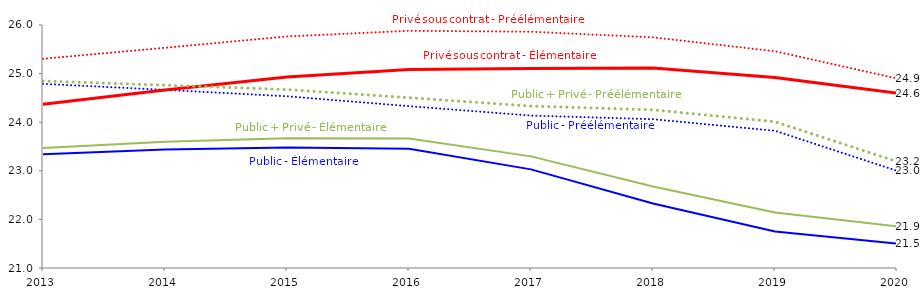
| Category | Public - Préélémentaire | Public - Élémentaire | Privé sous contrat - Préélémentaire | Privé sous contrat - Élémentaire | Public + Privé - Préélémentaire | Public + Privé - Élémentaire |
|---|---|---|---|---|---|---|
| 2013.0 | 24.789 | 23.339 | 25.305 | 24.368 | 24.847 | 23.471 |
| 2014.0 | 24.666 | 23.44 | 25.531 | 24.664 | 24.762 | 23.597 |
| 2015.0 | 24.533 | 23.482 | 25.765 | 24.929 | 24.672 | 23.67 |
| 2016.0 | 24.33 | 23.452 | 25.88 | 25.084 | 24.504 | 23.663 |
| 2017.0 | 24.136 | 23.029 | 25.862 | 25.104 | 24.332 | 23.297 |
| 2018.0 | 24.062 | 22.325 | 25.746 | 25.114 | 24.254 | 22.676 |
| 2019.0 | 23.824 | 21.749 | 25.46 | 24.918 | 24.01 | 22.141 |
| 2020.0 | 23 | 21.5 | 24.9 | 24.6 | 23.19 | 21.855 |